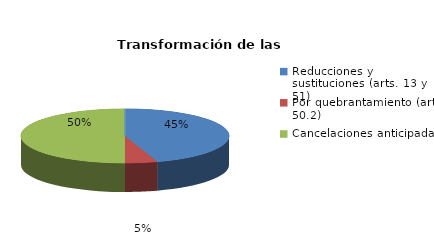
| Category | Series 0 |
|---|---|
| Reducciones y sustituciones (arts. 13 y 51) | 9 |
| Por quebrantamiento (art. 50.2) | 1 |
| Cancelaciones anticipadas | 10 |
| Traslado a Centros Penitenciarios | 0 |
| Conversión internamientos en cerrados (art. 51.2) | 0 |